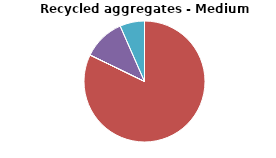
| Category | Series 0 |
|---|---|
| DRILLING AND BLASTING | 0 |
| MATERIAL PROCESSING | 30.767 |
| INTERNAL TRANSPORT | 0 |
| MATERIAL HANDLING OPERATION | 4.197 |
| WIND EROSION FROM STOCKPILES | 2.467 |